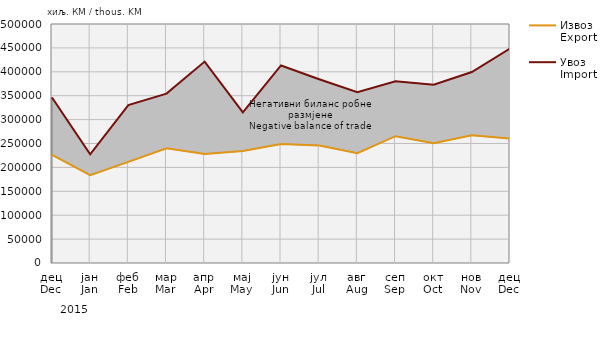
| Category | Извоз
Export | Увоз
Import |
|---|---|---|
| дец
Dec | 226207 | 346357 |
| јан
Jan | 183779 | 227458 |
| феб
Feb | 211524 | 330459 |
| мар
Mar | 239782 | 354355 |
| апр
Apr | 228100 | 421365 |
| мај
May | 234236 | 315075 |
| јун
Jun | 248861 | 413259 |
| јул
Jul | 245925 | 384444 |
| авг
Aug | 229795 | 357467 |
| сеп
Sep | 265272 | 380274 |
| окт
Oct | 250736 | 372983 |
| нов
Nov | 267042 | 399617 |
| дец
Dec | 260279 | 448853 |